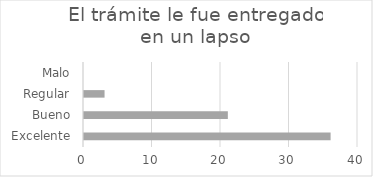
| Category | Series 0 |
|---|---|
| Excelente | 36 |
| Bueno | 21 |
| Regular | 3 |
| Malo | 0 |